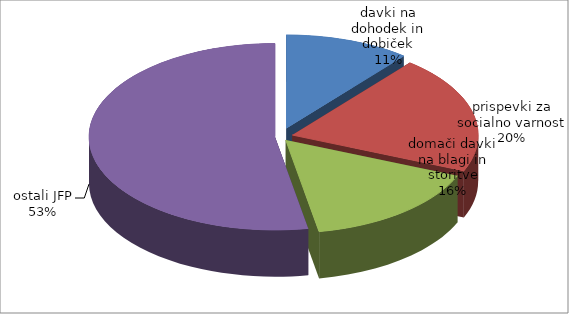
| Category | Series 0 |
|---|---|
| davki na dohodek in dobiček | 10.886 |
| prispevki za socialno varnost | 20.394 |
| domači davki na blagi in storitve | 15.851 |
| ostali JFP | 52.868 |